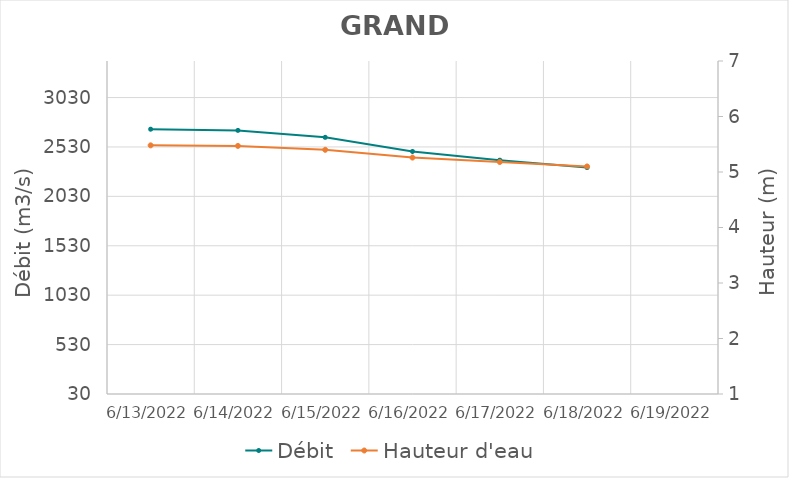
| Category | Débit |
|---|---|
| 4/26/22 | 3205.71 |
| 4/25/22 | 3076.9 |
| 4/24/22 | 3022.48 |
| 4/23/22 | 2956.02 |
| 4/22/22 | 2862.73 |
| 4/21/22 | 2621.07 |
| 4/20/22 | 2679.31 |